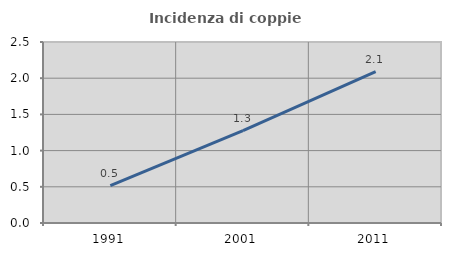
| Category | Incidenza di coppie miste |
|---|---|
| 1991.0 | 0.518 |
| 2001.0 | 1.276 |
| 2011.0 | 2.091 |